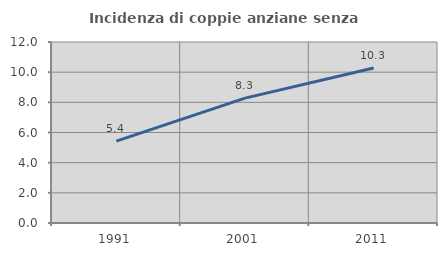
| Category | Incidenza di coppie anziane senza figli  |
|---|---|
| 1991.0 | 5.427 |
| 2001.0 | 8.277 |
| 2011.0 | 10.273 |